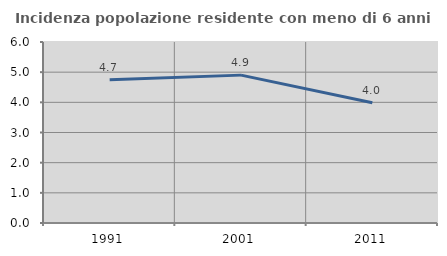
| Category | Incidenza popolazione residente con meno di 6 anni |
|---|---|
| 1991.0 | 4.749 |
| 2001.0 | 4.902 |
| 2011.0 | 3.988 |